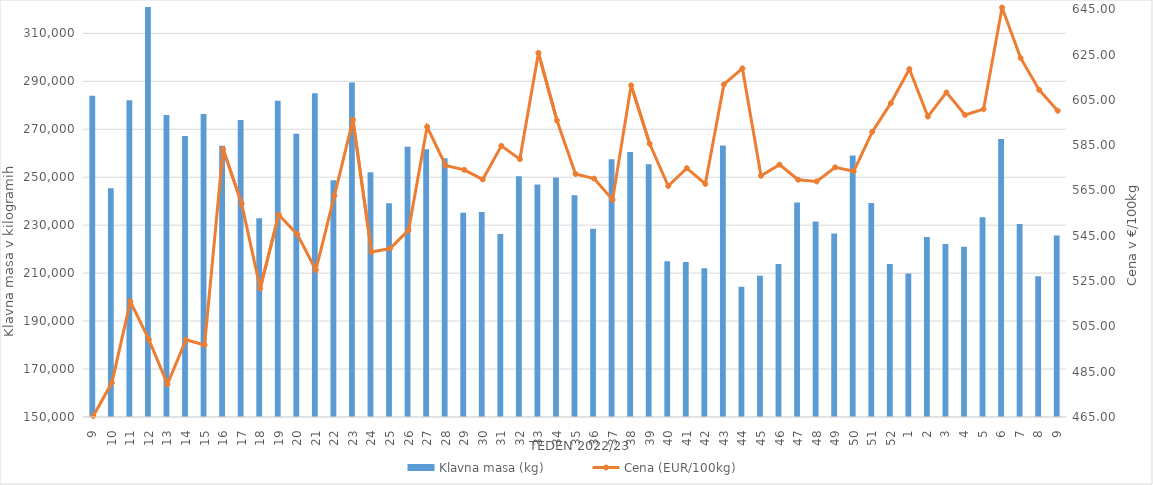
| Category | Klavna masa (kg) |
|---|---|
| 9.0 | 283987 |
| 10.0 | 245414 |
| 11.0 | 282092 |
| 12.0 | 321936 |
| 13.0 | 275950 |
| 14.0 | 267148 |
| 15.0 | 276417 |
| 16.0 | 263098 |
| 17.0 | 273824 |
| 18.0 | 232926 |
| 19.0 | 281859 |
| 20.0 | 268153 |
| 21.0 | 285073 |
| 22.0 | 248783 |
| 23.0 | 289478 |
| 24.0 | 252069 |
| 25.0 | 239099 |
| 26.0 | 262689 |
| 27.0 | 261656 |
| 28.0 | 257905 |
| 29.0 | 235185 |
| 30.0 | 235475 |
| 31.0 | 226322 |
| 32.0 | 250418 |
| 33.0 | 246996 |
| 34.0 | 249873 |
| 35.0 | 242516 |
| 36.0 | 228469 |
| 37.0 | 257511 |
| 38.0 | 260481 |
| 39.0 | 255370 |
| 40.0 | 214936 |
| 41.0 | 214672 |
| 42.0 | 212066 |
| 43.0 | 263287 |
| 44.0 | 204280 |
| 45.0 | 208920 |
| 46.0 | 213836 |
| 47.0 | 239417 |
| 48.0 | 231565 |
| 49.0 | 226575 |
| 50.0 | 259073 |
| 51.0 | 239211 |
| 52.0 | 213841 |
| 1.0 | 209877 |
| 2.0 | 225045 |
| 3.0 | 222198 |
| 4.0 | 221002 |
| 5.0 | 233306 |
| 6.0 | 265944 |
| 7.0 | 230531 |
| 8.0 | 208699 |
| 9.0 | 225712 |